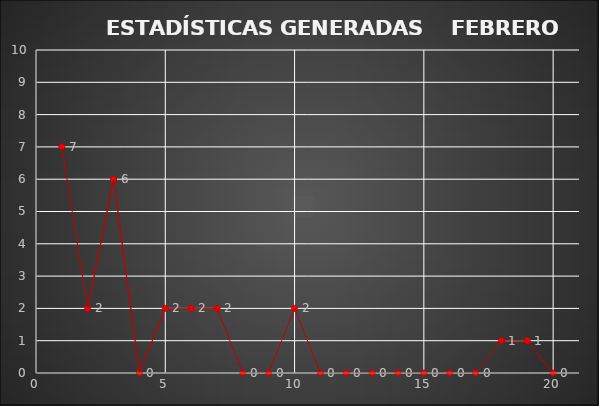
| Category | Series 0 |
|---|---|
| 0 | 7 |
| 1 | 2 |
| 2 | 6 |
| 3 | 0 |
| 4 | 2 |
| 5 | 2 |
| 6 | 2 |
| 7 | 0 |
| 8 | 0 |
| 9 | 2 |
| 10 | 0 |
| 11 | 0 |
| 12 | 0 |
| 13 | 0 |
| 14 | 0 |
| 15 | 0 |
| 16 | 0 |
| 17 | 1 |
| 18 | 1 |
| 19 | 0 |